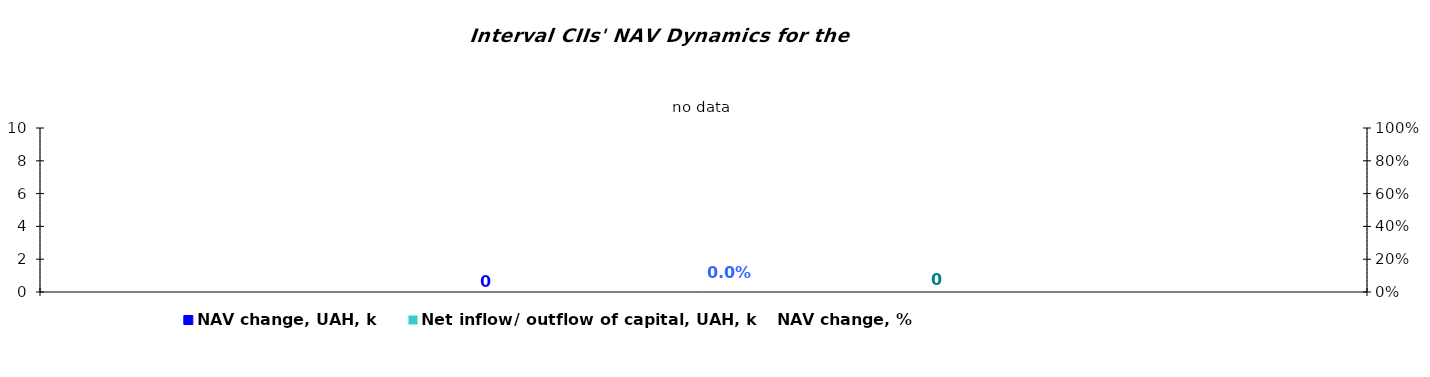
| Category | NAV change, UAH, k | Net inflow/ outflow of capital, UAH, k |
|---|---|---|
| no data | 0 | 0 |